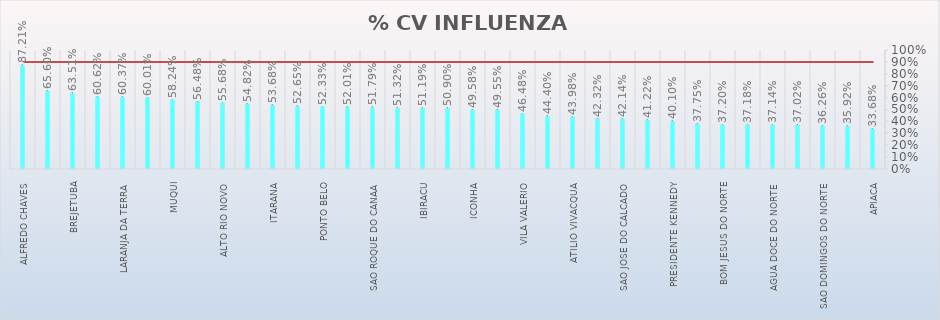
| Category | % CV INFLUENZA |
|---|---|
| ALFREDO CHAVES | 0.872 |
| CONCEICAO DO CASTELO | 0.656 |
| BREJETUBA | 0.635 |
| MARILANDIA | 0.606 |
| LARANJA DA TERRA | 0.604 |
| ITAGUACU | 0.6 |
| MUQUI | 0.582 |
| DIVINO DE SAO LOURENCO | 0.565 |
| ALTO RIO NOVO | 0.557 |
| GOVERNADOR LINDENBERG | 0.548 |
| ITARANA | 0.537 |
| RIO NOVO DO SUL | 0.527 |
| PONTO BELO | 0.523 |
| JOAO NEIVA | 0.52 |
| SAO ROQUE DO CANAA | 0.518 |
| DORES DO RIO PRETO | 0.513 |
| IBIRACU | 0.512 |
| JERONIMO MONTEIRO | 0.509 |
| ICONHA | 0.496 |
| IRUPI | 0.496 |
| VILA VALERIO | 0.465 |
| MUCURICI | 0.444 |
| ATILIO VIVACQUA | 0.44 |
| VILA PAVAO | 0.423 |
| SAO JOSE DO CALCADO | 0.421 |
| BOA ESPERANCA | 0.412 |
| PRESIDENTE KENNEDY | 0.401 |
| AGUIA BRANCA | 0.378 |
| BOM JESUS DO NORTE | 0.372 |
| SANTA LEOPOLDINA | 0.372 |
| AGUA DOCE DO NORTE | 0.371 |
| MANTENOPOLIS | 0.37 |
| SAO DOMINGOS DO NORTE | 0.363 |
| IBITIRAMA | 0.359 |
| APIACA | 0.337 |